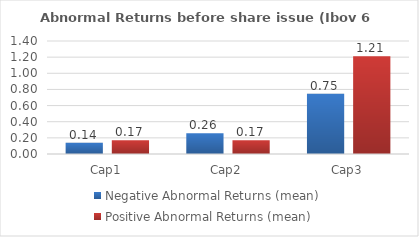
| Category | Negative Abnormal Returns (mean) | Positive Abnormal Returns (mean) |
|---|---|---|
| Cap1 | 0.138 | 0.169 |
| Cap2 | 0.258 | 0.171 |
| Cap3 | 0.745 | 1.212 |